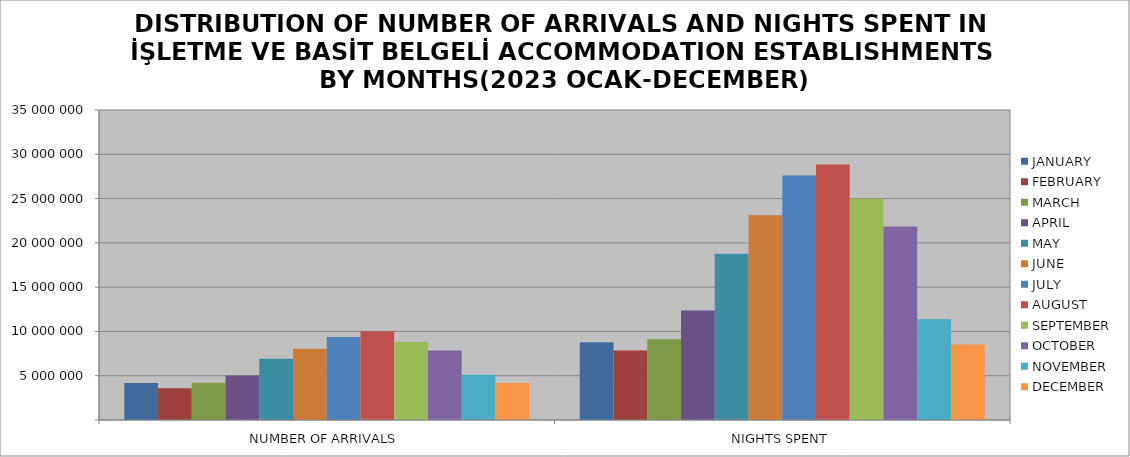
| Category | JANUARY | FEBRUARY | MARCH | APRIL | MAY | JUNE | JULY | AUGUST | SEPTEMBER | OCTOBER | NOVEMBER | DECEMBER |
|---|---|---|---|---|---|---|---|---|---|---|---|---|
| NUMBER OF ARRIVALS | 4176369 | 3577989 | 4200030 | 5022587 | 6927000 | 8050681 | 9379348 | 10028953 | 8800056 | 7838230 | 5119651 | 4177197 |
| NIGHTS SPENT | 8783046 | 7837722 | 9122802 | 12360237 | 18778808 | 23106038 | 27617279 | 28851182 | 24974127 | 21858050 | 11363529 | 8535010 |